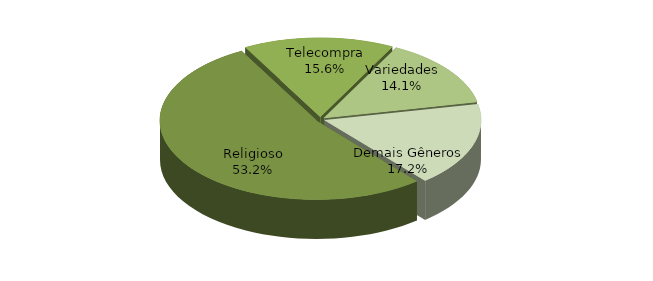
| Category | Series 0 |
|---|---|
| Religioso | 0.532 |
| Telecompra | 0.156 |
| Variedades | 0.141 |
| Demais Gêneros | 0.172 |